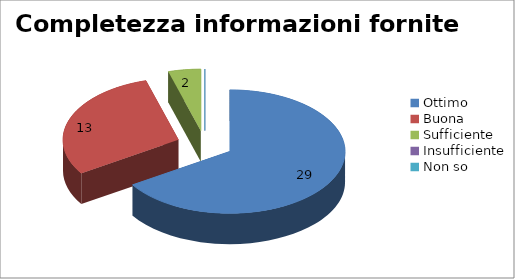
| Category | Completezza informazioni fornite |
|---|---|
| Ottimo | 29 |
| Buona | 13 |
| Sufficiente | 2 |
| Insufficiente | 0 |
| Non so | 0 |